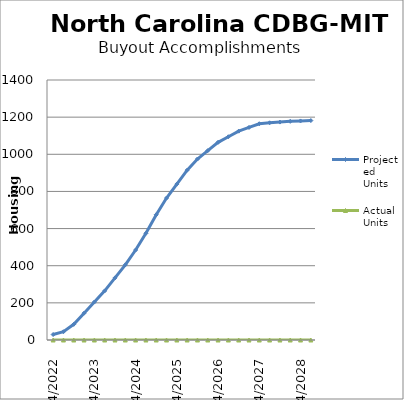
| Category | Projected Units | Actual Units |
|---|---|---|
| 04/2022 | 29.5 | 0 |
| 07/2022 | 44.5 | 0 |
| 10/2022 | 84.5 | 0 |
| 01/2023 | 144.5 | 0 |
| 04/2023 | 204.5 | 0 |
| 07/2023 | 264.5 | 0 |
| 10/2023 | 334.5 | 0 |
| 01/2024 | 404.5 | 0 |
| 04/2024 | 484.5 | 0 |
| 07/2024 | 574.5 | 0 |
| 10/2024 | 674.5 | 0 |
| 01/2025 | 764.5 | 0 |
| 04/2025 | 839.5 | 0 |
| 07/2025 | 914.5 | 0 |
| 10/2025 | 974.5 | 0 |
| 01/2026 | 1019.5 | 0 |
| 04/2026 | 1064.5 | 0 |
| 07/2026 | 1094.5 | 0 |
| 10/2026 | 1124.5 | 0 |
| 01/2027 | 1144.5 | 0 |
| 04/2027 | 1164.5 | 0 |
| 07/2027 | 1169.5 | 0 |
| 10/2027 | 1173.5 | 0 |
| 01/2028 | 1177.5 | 0 |
| 04/2028 | 1179.5 | 0 |
| 07/2028 | 1181.5 | 0 |